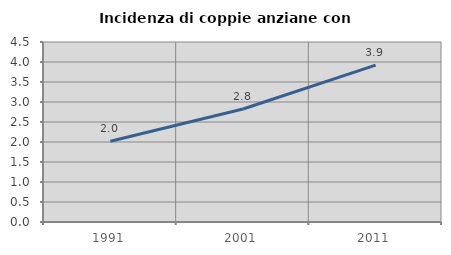
| Category | Incidenza di coppie anziane con figli |
|---|---|
| 1991.0 | 2.02 |
| 2001.0 | 2.825 |
| 2011.0 | 3.922 |